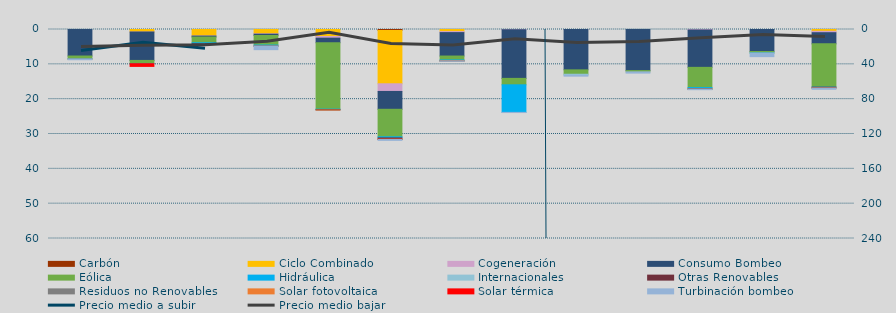
| Category | Carbón | Ciclo Combinado | Cogeneración | Consumo Bombeo | Enlace Península Baleares | Eólica | Hidráulica | Internacionales | Otras Renovables | Residuos no Renovables | Solar fotovoltaica | Solar térmica | Turbinación bombeo |
|---|---|---|---|---|---|---|---|---|---|---|---|---|---|
| 0 | 0 | 0 | 0 | 7614.5 |  | 781.3 | 105.7 | 0 | 0 | 0 | 2.1 | 0 | 181 |
| 1 | 0 | 720.2 | 1.2 | 8158 |  | 874.3 | 55.9 | 0 | 0 | 0 | 0 | 782.4 | 0 |
| 2 | 0 | 1851.6 | 42.3 | 273.4 |  | 1634.9 | 310 | 0 | 3.7 | 0 | 0 | 0 | 0 |
| 3 | 0 | 1244.2 | 103.6 | 370.8 |  | 2746.7 | 304.8 | 0 | 15.4 | 0 | 0.1 | 0 | 1000.2 |
| 4 | 0 | 2003.8 | 480.6 | 1308.7 |  | 19069.4 | 129.7 | 0 | 113.5 | 0 | 2 | 0 | 0 |
| 5 | 274.3 | 15310.9 | 2199.5 | 5123.2 |  | 7894.3 | 324.4 | 0 | 365.6 | 0 | 33.3 | 39.3 | 259.1 |
| 6 | 0 | 600 | 290.9 | 6727.7 |  | 1121.1 | 272.6 | 0 | 7.6 | 12.5 | 0.4 | 0 | 84 |
| 7 | 0 | 0 | 66 | 13968.1 |  | 1844.7 | 7917.4 | 0 | 0 | 0 | 0 | 0 | 46.9 |
| 8 | 0 | 0 | 13.8 | 11574.5 |  | 1255.7 | 0 | 313 | 0 | 0 | 0 | 0 | 240.1 |
| 9 | 0 | 0 | 0 | 11798.2 |  | 360.9 | 0 | 0 | 0 | 0 | 0 | 0 | 358.6 |
| 10 | 0 | 0 | 132.9 | 10732.4 |  | 5808.3 | 350.7 | 0 | 98.7 | 0 | 2.1 | 0 | 152.1 |
| 11 | 0 | 0 | 0 | 6311.1 |  | 429.6 | 2 | 0 | 0 | 0 | 0 | 0 | 1049.5 |
| 12 | 0 | 520 | 398.7 | 3208 |  | 12396.3 | 41.7 | 0 | 256.7 | 0 | 0.8 | 0 | 340.4 |